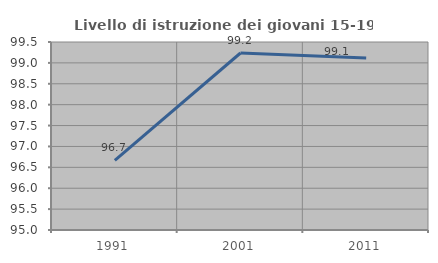
| Category | Livello di istruzione dei giovani 15-19 anni |
|---|---|
| 1991.0 | 96.667 |
| 2001.0 | 99.237 |
| 2011.0 | 99.115 |